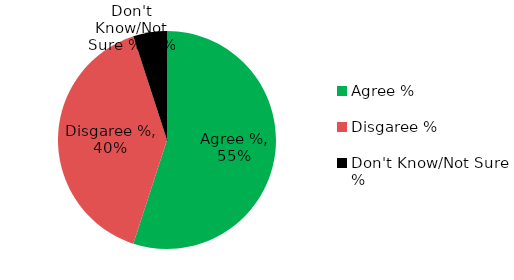
| Category | Agree % |
|---|---|
| Agree % | 0.55 |
| Disgaree % | 0.4 |
| Don't Know/Not Sure % | 0.05 |